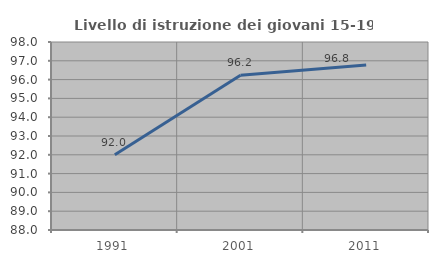
| Category | Livello di istruzione dei giovani 15-19 anni |
|---|---|
| 1991.0 | 92 |
| 2001.0 | 96.226 |
| 2011.0 | 96.774 |